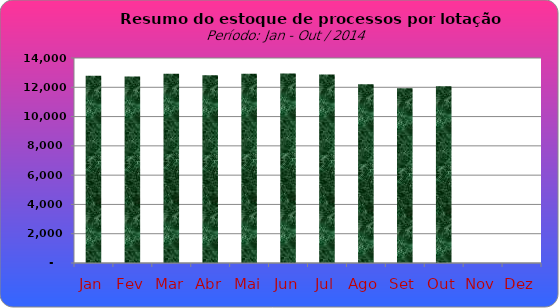
| Category | Series 0 |
|---|---|
| Jan | 12795 |
| Fev | 12744 |
| Mar | 12928 |
| Abr | 12816 |
| Mai | 12923 |
| Jun | 12943 |
| Jul | 12869 |
| Ago | 12202 |
| Set | 11937 |
| Out | 12070 |
| Nov | 0 |
| Dez | 0 |